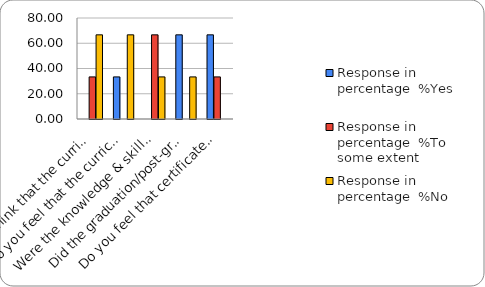
| Category | Response in percentage  |
|---|---|
| Do you think that the curriculum which you had during your graduation/post graduation has provided you with the knowledge & skills necessary to get employed/Self-employed or start own business? | 66.667 |
| Do you feel that the curriculum you studied is helpful in progression to higher studies? | 66.667 |
| Were the knowledge & skills acquired through the curriculum useful to you while working on the job?   | 33.333 |
| Did the graduation/post-graduation programme bring about any attitudinal and behavioural change in you? | 33.333 |
| Do you feel that certificate/ diploma courses offered by the college in addition to the curriculum lead to better career prospects? | 0 |